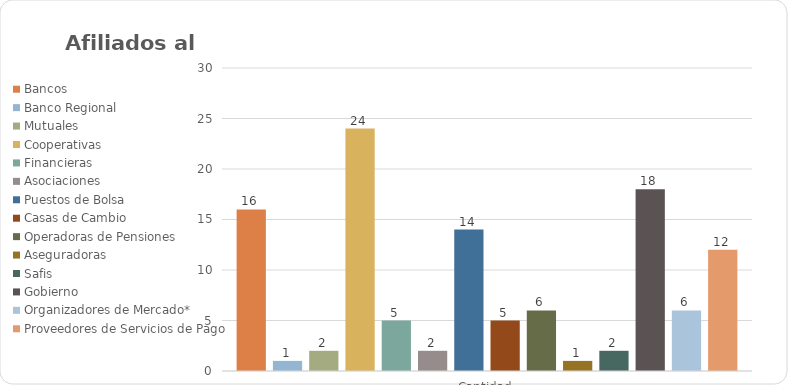
| Category | Bancos | Banco Regional | Mutuales | Cooperativas | Financieras | Asociaciones | Puestos de Bolsa | Casas de Cambio | Operadoras de Pensiones | Aseguradoras | Safis | Gobierno | Organizadores de Mercado* | Proveedores de Servicios de Pago |
|---|---|---|---|---|---|---|---|---|---|---|---|---|---|---|
| Cantidad | 16 | 1 | 2 | 24 | 5 | 2 | 14 | 5 | 6 | 1 | 2 | 18 | 6 | 12 |